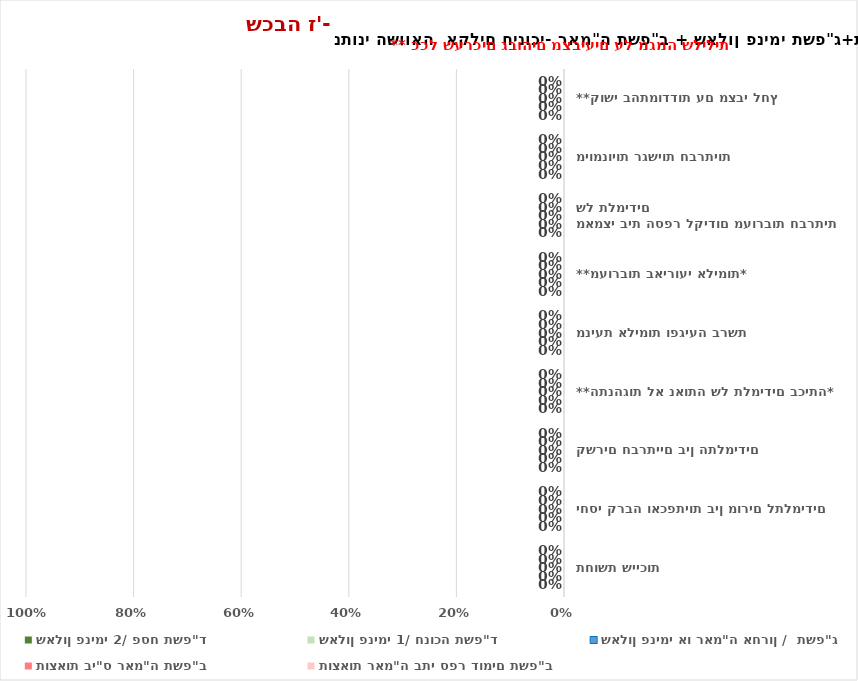
| Category | שאלון פנימי 2/ פסח תשפ"ד  | שאלון פנימי 1/ חנוכה תשפ"ד | שאלון פנימי או ראמ"ה אחרון /  תשפ"ג   | תוצאות בי"ס ראמ"ה תשפ"ב  | תוצאות ראמ"ה בתי ספר דומים תשפ"ב   |
|---|---|---|---|---|---|
| תחושת שייכות | 0 | 0 | 0 | 0 | 0 |
| יחסי קרבה ואכפתיות בין מורים לתלמידים | 0 | 0 | 0 | 0 | 0 |
| קשרים חברתיים בין התלמידים | 0 | 0 | 0 | 0 | 0 |
| **התנהגות לא נאותה של תלמידים בכיתה* | 0 | 0 | 0 | 0 | 0 |
| מניעת אלימות ופגיעה ברשת | 0 | 0 | 0 | 0 | 0 |
| **מעורבות באירועי אלימות* | 0 | 0 | 0 | 0 | 0 |
| מאמצי בית הספר לקידום מעורבות חברתית של תלמידים | 0 | 0 | 0 | 0 | 0 |
| מיומנויות רגשיות חברתיות | 0 | 0 | 0 | 0 | 0 |
| **קושי בהתמודדות עם מצבי לחץ | 0 | 0 | 0 | 0 | 0 |